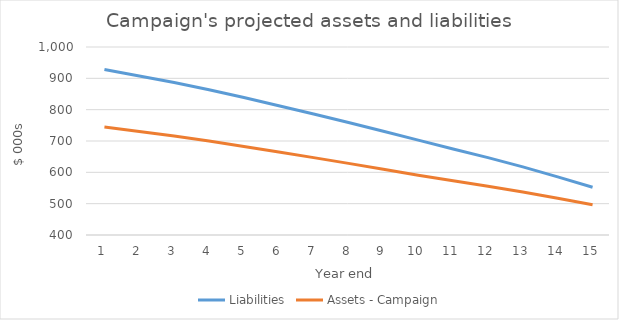
| Category | Liabilities | Assets - Campaign |
|---|---|---|
| 0 | 928.321 | 744.676 |
| 1 | 907.637 | 730.297 |
| 2 | 886.446 | 715.672 |
| 3 | 863.385 | 699.741 |
| 4 | 838.637 | 682.679 |
| 5 | 812.599 | 664.724 |
| 6 | 786.41 | 646.949 |
| 7 | 759.182 | 628.537 |
| 8 | 731.089 | 609.701 |
| 9 | 702.741 | 591.021 |
| 10 | 674.62 | 572.898 |
| 11 | 646.835 | 555.456 |
| 12 | 617.46 | 537.109 |
| 13 | 585.634 | 517.128 |
| 14 | 552.439 | 496.466 |